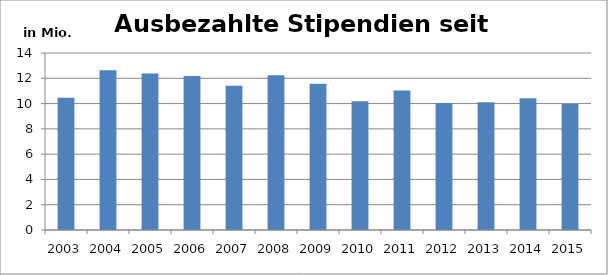
| Category | Stipendien-
auszahlungen 
in Mio. Fr. |
|---|---|
| 2003.0 | 10.46 |
| 2004.0 | 12.63 |
| 2005.0 | 12.38 |
| 2006.0 | 12.18 |
| 2007.0 | 11.41 |
| 2008.0 | 12.24 |
| 2009.0 | 11.56 |
| 2010.0 | 10.19 |
| 2011.0 | 11.03 |
| 2012.0 | 10.04 |
| 2013.0 | 10.11 |
| 2014.0 | 10.43 |
| 2015.0 | 9.97 |